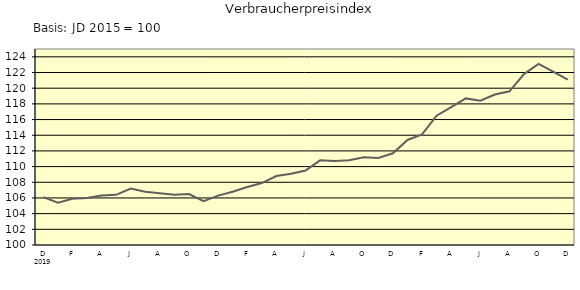
| Category | Series 0 |
|---|---|
| 0 | 106.1 |
| 1 | 105.4 |
| 2 | 105.9 |
| 3 | 106 |
| 4 | 106.3 |
| 5 | 106.4 |
| 6 | 107.2 |
| 7 | 106.8 |
| 8 | 106.6 |
| 9 | 106.4 |
| 10 | 106.5 |
| 11 | 105.6 |
| 12 | 106.3 |
| 13 | 106.8 |
| 14 | 107.4 |
| 15 | 107.9 |
| 16 | 108.8 |
| 17 | 109.1 |
| 18 | 109.5 |
| 19 | 110.8 |
| 20 | 110.7 |
| 21 | 110.8 |
| 22 | 111.2 |
| 23 | 111.1 |
| 24 | 111.7 |
| 25 | 113.4 |
| 26 | 114.1 |
| 27 | 116.5 |
| 28 | 117.6 |
| 29 | 118.7 |
| 30 | 118.4 |
| 31 | 119.2 |
| 32 | 119.6 |
| 33 | 121.8 |
| 34 | 123.1 |
| 35 | 122.1 |
| 36 | 121.1 |